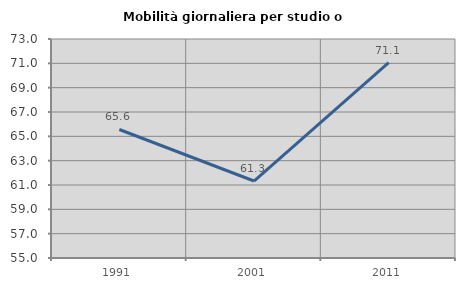
| Category | Mobilità giornaliera per studio o lavoro |
|---|---|
| 1991.0 | 65.562 |
| 2001.0 | 61.327 |
| 2011.0 | 71.066 |